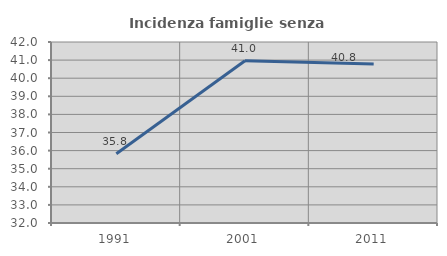
| Category | Incidenza famiglie senza nuclei |
|---|---|
| 1991.0 | 35.827 |
| 2001.0 | 40.959 |
| 2011.0 | 40.78 |